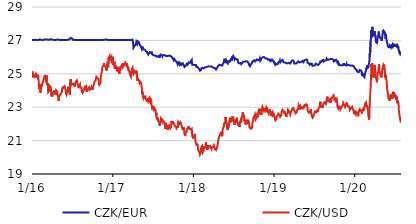
| Category | CZK/EUR | CZK/USD |
|---|---|---|
| 2016-01-04 | 27.02 | 24.794 |
| 2016-01-05 | 27.02 | 25.145 |
| 2016-01-06 | 27.025 | 25.196 |
| 2016-01-07 | 27.03 | 24.873 |
| 2016-01-08 | 27.02 | 24.873 |
| 2016-01-11 | 27.02 | 24.815 |
| 2016-01-12 | 27.02 | 24.937 |
| 2016-01-13 | 27.02 | 24.983 |
| 2016-01-14 | 27.02 | 24.804 |
| 2016-01-15 | 27.02 | 24.756 |
| 2016-01-18 | 27.035 | 24.821 |
| 2016-01-19 | 27.025 | 24.865 |
| 2016-01-20 | 27.04 | 24.789 |
| 2016-01-21 | 27.065 | 24.844 |
| 2016-01-22 | 27.025 | 25.002 |
| 2016-01-25 | 27.02 | 24.98 |
| 2016-01-26 | 27.02 | 24.928 |
| 2016-01-27 | 27.025 | 24.82 |
| 2016-01-28 | 27.02 | 24.78 |
| 2016-01-29 | 27.025 | 24.76 |
| 2016-02-01 | 27.02 | 24.823 |
| 2016-02-02 | 27.025 | 24.748 |
| 2016-02-03 | 27.02 | 24.72 |
| 2016-02-04 | 27.02 | 24.11 |
| 2016-02-05 | 27.035 | 24.134 |
| 2016-02-08 | 27.06 | 24.379 |
| 2016-02-09 | 27.06 | 24.09 |
| 2016-02-10 | 27.03 | 24.006 |
| 2016-02-11 | 27.07 | 23.857 |
| 2016-02-12 | 27.065 | 24.004 |
| 2016-02-15 | 27.035 | 24.182 |
| 2016-02-16 | 27.03 | 24.214 |
| 2016-02-17 | 27.03 | 24.276 |
| 2016-02-18 | 27.02 | 24.375 |
| 2016-02-19 | 27.025 | 24.351 |
| 2016-02-22 | 27.02 | 24.505 |
| 2016-02-23 | 27.03 | 24.57 |
| 2016-02-24 | 27.045 | 24.629 |
| 2016-02-25 | 27.05 | 24.526 |
| 2016-02-26 | 27.065 | 24.589 |
| 2016-02-29 | 27.055 | 24.848 |
| 2016-03-01 | 27.055 | 24.879 |
| 2016-03-02 | 27.045 | 24.933 |
| 2016-03-03 | 27.055 | 24.819 |
| 2016-03-04 | 27.06 | 24.661 |
| 2016-03-07 | 27.055 | 24.692 |
| 2016-03-08 | 27.06 | 24.541 |
| 2016-03-09 | 27.045 | 24.64 |
| 2016-03-10 | 27.035 | 24.899 |
| 2016-03-11 | 27.06 | 24.398 |
| 2016-03-14 | 27.05 | 24.324 |
| 2016-03-15 | 27.045 | 24.347 |
| 2016-03-16 | 27.05 | 24.45 |
| 2016-03-17 | 27.045 | 23.908 |
| 2016-03-18 | 27.035 | 23.966 |
| 2016-03-21 | 27.03 | 23.98 |
| 2016-03-22 | 27.035 | 24.117 |
| 2016-03-23 | 27.035 | 24.201 |
| 2016-03-24 | 27.065 | 24.267 |
| 2016-03-29 | 27.075 | 24.183 |
| 2016-03-30 | 27.075 | 23.896 |
| 2016-03-31 | 27.055 | 23.757 |
| 2016-04-01 | 27.03 | 23.64 |
| 2016-04-04 | 27.05 | 23.766 |
| 2016-04-05 | 27.035 | 23.774 |
| 2016-04-06 | 27.03 | 23.834 |
| 2016-04-07 | 27.025 | 23.775 |
| 2016-04-08 | 27.02 | 23.771 |
| 2016-04-11 | 27.025 | 23.724 |
| 2016-04-12 | 27.03 | 23.717 |
| 2016-04-13 | 27.035 | 23.923 |
| 2016-04-14 | 27.03 | 24.018 |
| 2016-04-15 | 27.025 | 23.948 |
| 2016-04-18 | 27.02 | 23.889 |
| 2016-04-19 | 27.02 | 23.821 |
| 2016-04-20 | 27.02 | 23.743 |
| 2016-04-21 | 27.025 | 23.798 |
| 2016-04-22 | 27.045 | 24.014 |
| 2016-04-25 | 27.045 | 24.014 |
| 2016-04-26 | 27.025 | 23.946 |
| 2016-04-27 | 27.035 | 23.916 |
| 2016-04-28 | 27.045 | 23.811 |
| 2016-04-29 | 27.04 | 23.714 |
| 2016-05-02 | 27.05 | 23.534 |
| 2016-05-03 | 27.035 | 23.383 |
| 2016-05-04 | 27.03 | 23.457 |
| 2016-05-05 | 27.03 | 23.628 |
| 2016-05-06 | 27.02 | 23.654 |
| 2016-05-09 | 27.02 | 23.717 |
| 2016-05-10 | 27.025 | 23.762 |
| 2016-05-11 | 27.02 | 23.681 |
| 2016-05-12 | 27.025 | 23.729 |
| 2016-05-13 | 27.02 | 23.81 |
| 2016-05-16 | 27.02 | 23.859 |
| 2016-05-17 | 27.02 | 23.873 |
| 2016-05-18 | 27.02 | 23.955 |
| 2016-05-19 | 27.02 | 24.133 |
| 2016-05-20 | 27.025 | 24.083 |
| 2016-05-23 | 27.035 | 24.106 |
| 2016-05-24 | 27.025 | 24.192 |
| 2016-05-25 | 27.03 | 24.253 |
| 2016-05-26 | 27.025 | 24.192 |
| 2016-05-27 | 27.03 | 24.203 |
| 2016-05-30 | 27.02 | 24.255 |
| 2016-05-31 | 27.02 | 24.223 |
| 2016-06-01 | 27.025 | 24.186 |
| 2016-06-02 | 27.03 | 24.167 |
| 2016-06-03 | 27.025 | 24.221 |
| 2016-06-06 | 27.025 | 23.805 |
| 2016-06-07 | 27.02 | 23.815 |
| 2016-06-08 | 27.02 | 23.743 |
| 2016-06-09 | 27.02 | 23.815 |
| 2016-06-10 | 27.025 | 23.905 |
| 2016-06-13 | 27.035 | 23.997 |
| 2016-06-14 | 27.045 | 24.088 |
| 2016-06-15 | 27.075 | 24.103 |
| 2016-06-16 | 27.065 | 24.224 |
| 2016-06-17 | 27.07 | 24.052 |
| 2016-06-20 | 27.06 | 23.877 |
| 2016-06-21 | 27.065 | 23.923 |
| 2016-06-22 | 27.07 | 23.976 |
| 2016-06-23 | 27.06 | 23.761 |
| 2016-06-24 | 27.1 | 24.491 |
| 2016-06-27 | 27.15 | 24.692 |
| 2016-06-28 | 27.11 | 24.484 |
| 2016-06-29 | 27.115 | 24.443 |
| 2016-06-30 | 27.13 | 24.433 |
| 2016-07-01 | 27.095 | 24.335 |
| 2016-07-04 | 27.095 | 24.322 |
| 2016-07-07 | 27.05 | 24.417 |
| 2016-07-08 | 27.03 | 24.421 |
| 2016-07-11 | 27.035 | 24.458 |
| 2016-07-12 | 27.035 | 24.367 |
| 2016-07-13 | 27.035 | 24.415 |
| 2016-07-14 | 27.04 | 24.235 |
| 2016-07-15 | 27.03 | 24.284 |
| 2016-07-18 | 27.025 | 24.446 |
| 2016-07-19 | 27.025 | 24.488 |
| 2016-07-20 | 27.02 | 24.532 |
| 2016-07-21 | 27.025 | 24.53 |
| 2016-07-22 | 27.025 | 24.535 |
| 2016-07-25 | 27.02 | 24.601 |
| 2016-07-26 | 27.025 | 24.573 |
| 2016-07-27 | 27.035 | 24.594 |
| 2016-07-28 | 27.045 | 24.382 |
| 2016-07-29 | 27.03 | 24.324 |
| 2016-08-01 | 27.03 | 24.212 |
| 2016-08-02 | 27.03 | 24.147 |
| 2016-08-03 | 27.035 | 24.143 |
| 2016-08-04 | 27.03 | 24.273 |
| 2016-08-05 | 27.02 | 24.219 |
| 2016-08-08 | 27.03 | 24.38 |
| 2016-08-09 | 27.025 | 24.392 |
| 2016-08-10 | 27.025 | 24.17 |
| 2016-08-11 | 27.02 | 24.224 |
| 2016-08-12 | 27.02 | 24.211 |
| 2016-08-15 | 27.02 | 24.162 |
| 2016-08-16 | 27.02 | 23.918 |
| 2016-08-17 | 27.025 | 23.973 |
| 2016-08-18 | 27.025 | 23.865 |
| 2016-08-19 | 27.02 | 23.851 |
| 2016-08-22 | 27.025 | 23.901 |
| 2016-08-23 | 27.025 | 23.832 |
| 2016-08-24 | 27.025 | 23.984 |
| 2016-08-25 | 27.03 | 23.938 |
| 2016-08-26 | 27.02 | 23.928 |
| 2016-08-29 | 27.02 | 24.192 |
| 2016-08-30 | 27.025 | 24.196 |
| 2016-08-31 | 27.03 | 24.286 |
| 2016-09-01 | 27.025 | 24.252 |
| 2016-09-02 | 27.02 | 24.138 |
| 2016-09-05 | 27.02 | 24.218 |
| 2016-09-06 | 27.02 | 24.211 |
| 2016-09-07 | 27.02 | 24.041 |
| 2016-09-08 | 27.02 | 23.921 |
| 2016-09-09 | 27.02 | 23.975 |
| 2016-09-12 | 27.025 | 24.074 |
| 2016-09-13 | 27.02 | 24.031 |
| 2016-09-14 | 27.025 | 24.083 |
| 2016-09-15 | 27.025 | 24.017 |
| 2016-09-16 | 27.025 | 24.073 |
| 2016-09-19 | 27.02 | 24.197 |
| 2016-09-20 | 27.02 | 24.16 |
| 2016-09-21 | 27.02 | 24.232 |
| 2016-09-22 | 27.02 | 24.046 |
| 2016-09-23 | 27.02 | 24.096 |
| 2016-09-26 | 27.02 | 23.992 |
| 2016-09-27 | 27.025 | 24.088 |
| 2016-09-29 | 27.02 | 24.076 |
| 2016-09-30 | 27.02 | 24.21 |
| 2016-10-03 | 27.02 | 24.049 |
| 2016-10-04 | 27.02 | 24.207 |
| 2016-10-05 | 27.02 | 24.085 |
| 2016-10-06 | 27.02 | 24.156 |
| 2016-10-07 | 27.02 | 24.249 |
| 2016-10-10 | 27.02 | 24.209 |
| 2016-10-11 | 27.02 | 24.387 |
| 2016-10-12 | 27.025 | 24.521 |
| 2016-10-13 | 27.02 | 24.478 |
| 2016-10-14 | 27.025 | 24.561 |
| 2016-10-17 | 27.025 | 24.584 |
| 2016-10-18 | 27.02 | 24.578 |
| 2016-10-19 | 27.02 | 24.611 |
| 2016-10-20 | 27.02 | 24.603 |
| 2016-10-21 | 27.02 | 24.82 |
| 2016-10-24 | 27.02 | 24.809 |
| 2016-10-25 | 27.02 | 24.846 |
| 2016-10-26 | 27.02 | 24.736 |
| 2016-10-27 | 27.02 | 24.729 |
| 2016-10-31 | 27.025 | 24.687 |
| 2016-11-01 | 27.025 | 24.508 |
| 2016-11-02 | 27.02 | 24.356 |
| 2016-11-03 | 27.02 | 24.426 |
| 2016-11-04 | 27.02 | 24.359 |
| 2016-11-07 | 27.02 | 24.424 |
| 2016-11-08 | 27.02 | 24.478 |
| 2016-11-09 | 27.025 | 24.521 |
| 2016-11-10 | 27.02 | 24.804 |
| 2016-11-11 | 27.055 | 24.802 |
| 2016-11-14 | 27.025 | 25.08 |
| 2016-11-15 | 27.03 | 25.106 |
| 2016-11-16 | 27.035 | 25.257 |
| 2016-11-18 | 27.035 | 25.436 |
| 2016-11-21 | 27.03 | 25.424 |
| 2016-11-22 | 27.045 | 25.474 |
| 2016-11-23 | 27.025 | 25.488 |
| 2016-11-24 | 27.035 | 25.629 |
| 2016-11-25 | 27.04 | 25.532 |
| 2016-11-28 | 27.045 | 25.538 |
| 2016-11-29 | 27.05 | 25.574 |
| 2016-11-30 | 27.06 | 25.455 |
| 2016-12-01 | 27.06 | 25.465 |
| 2016-12-02 | 27.06 | 25.426 |
| 2016-12-05 | 27.055 | 25.276 |
| 2016-12-06 | 27.045 | 25.191 |
| 2016-12-07 | 27.035 | 25.195 |
| 2016-12-08 | 27.04 | 25.134 |
| 2016-12-09 | 27.025 | 25.588 |
| 2016-12-12 | 27.025 | 25.511 |
| 2016-12-13 | 27.02 | 25.461 |
| 2016-12-14 | 27.025 | 25.386 |
| 2016-12-15 | 27.02 | 25.932 |
| 2016-12-16 | 27.02 | 25.882 |
| 2016-12-19 | 27.02 | 25.926 |
| 2016-12-20 | 27.02 | 26.068 |
| 2016-12-21 | 27.02 | 25.927 |
| 2016-12-22 | 27.02 | 25.869 |
| 2016-12-23 | 27.02 | 25.865 |
| 2016-12-27 | 27.02 | 25.866 |
| 2016-12-28 | 27.04 | 26 |
| 2016-12-29 | 27.02 | 25.849 |
| 2016-12-30 | 27.02 | 25.639 |
| 2017-01-02 | 27.02 | 25.819 |
| 2017-01-03 | 27.02 | 26.017 |
| 2017-01-04 | 27.02 | 25.889 |
| 2017-01-05 | 27.02 | 25.714 |
| 2017-01-06 | 27.02 | 25.516 |
| 2017-01-09 | 27.02 | 25.697 |
| 2017-01-10 | 27.02 | 25.571 |
| 2017-01-11 | 27.02 | 25.721 |
| 2017-01-12 | 27.02 | 25.3 |
| 2017-01-13 | 27.02 | 25.347 |
| 2017-01-16 | 27.02 | 25.503 |
| 2017-01-17 | 27.02 | 25.291 |
| 2017-01-18 | 27.02 | 25.335 |
| 2017-01-19 | 27.02 | 25.329 |
| 2017-01-20 | 27.02 | 25.414 |
| 2017-01-23 | 27.025 | 25.22 |
| 2017-01-24 | 27.02 | 25.141 |
| 2017-01-25 | 27.02 | 25.144 |
| 2017-01-26 | 27.02 | 25.252 |
| 2017-01-27 | 27.02 | 25.297 |
| 2017-01-30 | 27.02 | 25.421 |
| 2017-01-31 | 27.02 | 25.12 |
| 2017-02-01 | 27.02 | 25.074 |
| 2017-02-02 | 27.02 | 24.992 |
| 2017-02-03 | 27.02 | 25.155 |
| 2017-02-06 | 27.02 | 25.219 |
| 2017-02-07 | 27.02 | 25.306 |
| 2017-02-08 | 27.02 | 25.333 |
| 2017-02-09 | 27.02 | 25.268 |
| 2017-02-10 | 27.02 | 25.422 |
| 2017-02-13 | 27.02 | 25.421 |
| 2017-02-14 | 27.02 | 25.437 |
| 2017-02-15 | 27.02 | 25.596 |
| 2017-02-16 | 27.02 | 25.36 |
| 2017-02-17 | 27.02 | 25.372 |
| 2017-02-20 | 27.02 | 25.449 |
| 2017-02-21 | 27.02 | 25.644 |
| 2017-02-22 | 27.02 | 25.7 |
| 2017-02-23 | 27.02 | 25.556 |
| 2017-02-24 | 27.02 | 25.468 |
| 2017-02-27 | 27.02 | 25.522 |
| 2017-02-28 | 27.02 | 25.497 |
| 2017-03-01 | 27.02 | 25.654 |
| 2017-03-02 | 27.02 | 25.695 |
| 2017-03-03 | 27.02 | 25.574 |
| 2017-03-06 | 27.02 | 25.506 |
| 2017-03-07 | 27.02 | 25.547 |
| 2017-03-08 | 27.02 | 25.631 |
| 2017-03-09 | 27.02 | 25.613 |
| 2017-03-10 | 27.02 | 25.482 |
| 2017-03-13 | 27.02 | 25.339 |
| 2017-03-14 | 27.02 | 25.415 |
| 2017-03-15 | 27.02 | 25.434 |
| 2017-03-16 | 27.02 | 25.195 |
| 2017-03-17 | 27.02 | 25.154 |
| 2017-03-20 | 27.02 | 25.129 |
| 2017-03-21 | 27.02 | 25.009 |
| 2017-03-22 | 27.02 | 25.003 |
| 2017-03-23 | 27.02 | 25.05 |
| 2017-03-24 | 27.02 | 25.008 |
| 2017-03-27 | 27.02 | 24.813 |
| 2017-03-28 | 27.02 | 24.883 |
| 2017-03-29 | 27.02 | 25.14 |
| 2017-03-30 | 27.02 | 25.159 |
| 2017-03-31 | 27.03 | 25.282 |
| 2017-04-03 | 27.045 | 25.367 |
| 2017-04-04 | 27.055 | 25.404 |
| 2017-04-05 | 27.06 | 25.37 |
| 2017-04-06 | 26.75 | 25.076 |
| 2017-04-07 | 26.565 | 24.999 |
| 2017-04-10 | 26.53 | 25.082 |
| 2017-04-11 | 26.66 | 25.112 |
| 2017-04-12 | 26.695 | 25.172 |
| 2017-04-13 | 26.705 | 25.122 |
| 2017-04-18 | 26.76 | 25.053 |
| 2017-04-19 | 26.795 | 24.985 |
| 2017-04-20 | 26.91 | 25.043 |
| 2017-04-21 | 26.935 | 25.179 |
| 2017-04-24 | 26.795 | 24.706 |
| 2017-04-25 | 26.77 | 24.58 |
| 2017-04-26 | 26.945 | 24.735 |
| 2017-04-27 | 26.935 | 24.752 |
| 2017-04-28 | 26.92 | 24.629 |
| 2017-05-02 | 26.89 | 24.639 |
| 2017-05-03 | 26.87 | 24.607 |
| 2017-05-04 | 26.77 | 24.499 |
| 2017-05-05 | 26.78 | 24.433 |
| 2017-05-09 | 26.67 | 24.497 |
| 2017-05-10 | 26.64 | 24.486 |
| 2017-05-11 | 26.6 | 24.495 |
| 2017-05-12 | 26.575 | 24.435 |
| 2017-05-15 | 26.47 | 24.124 |
| 2017-05-16 | 26.42 | 23.888 |
| 2017-05-17 | 26.435 | 23.778 |
| 2017-05-18 | 26.63 | 23.927 |
| 2017-05-19 | 26.5 | 23.71 |
| 2017-05-22 | 26.485 | 23.557 |
| 2017-05-23 | 26.48 | 23.615 |
| 2017-05-24 | 26.465 | 23.642 |
| 2017-05-25 | 26.41 | 23.552 |
| 2017-05-26 | 26.435 | 23.606 |
| 2017-05-29 | 26.435 | 23.627 |
| 2017-05-30 | 26.465 | 23.69 |
| 2017-05-31 | 26.42 | 23.545 |
| 2017-06-01 | 26.395 | 23.554 |
| 2017-06-02 | 26.36 | 23.501 |
| 2017-06-05 | 26.325 | 23.401 |
| 2017-06-06 | 26.335 | 23.393 |
| 2017-06-07 | 26.315 | 23.459 |
| 2017-06-08 | 26.27 | 23.392 |
| 2017-06-09 | 26.22 | 23.463 |
| 2017-06-12 | 26.2 | 23.348 |
| 2017-06-13 | 26.145 | 23.308 |
| 2017-06-14 | 26.165 | 23.354 |
| 2017-06-15 | 26.21 | 23.468 |
| 2017-06-16 | 26.23 | 23.49 |
| 2017-06-19 | 26.17 | 23.369 |
| 2017-06-20 | 26.295 | 23.568 |
| 2017-06-21 | 26.265 | 23.565 |
| 2017-06-22 | 26.27 | 23.522 |
| 2017-06-23 | 26.295 | 23.53 |
| 2017-06-26 | 26.24 | 23.457 |
| 2017-06-27 | 26.27 | 23.29 |
| 2017-06-28 | 26.325 | 23.141 |
| 2017-06-29 | 26.285 | 23.032 |
| 2017-06-30 | 26.195 | 22.952 |
| 2017-07-03 | 26.14 | 22.993 |
| 2017-07-04 | 26.13 | 23.017 |
| 2017-07-07 | 26.08 | 22.852 |
| 2017-07-10 | 26.095 | 22.917 |
| 2017-07-11 | 26.125 | 22.907 |
| 2017-07-12 | 26.11 | 22.804 |
| 2017-07-13 | 26.12 | 22.878 |
| 2017-07-14 | 26.075 | 22.842 |
| 2017-07-17 | 26.09 | 22.762 |
| 2017-07-18 | 26.08 | 22.57 |
| 2017-07-19 | 26.035 | 22.572 |
| 2017-07-20 | 26.04 | 22.671 |
| 2017-07-21 | 26.02 | 22.347 |
| 2017-07-24 | 26.025 | 22.344 |
| 2017-07-25 | 26.02 | 22.25 |
| 2017-07-26 | 26.045 | 22.371 |
| 2017-07-27 | 26.045 | 22.269 |
| 2017-07-28 | 26.05 | 22.209 |
| 2017-07-31 | 26.08 | 22.24 |
| 2017-08-01 | 26.13 | 22.123 |
| 2017-08-02 | 26.125 | 22.099 |
| 2017-08-03 | 25.965 | 21.89 |
| 2017-08-04 | 26.065 | 21.961 |
| 2017-08-07 | 26.115 | 22.135 |
| 2017-08-08 | 26.15 | 22.134 |
| 2017-08-09 | 26.16 | 22.301 |
| 2017-08-10 | 26.16 | 22.297 |
| 2017-08-11 | 26.155 | 22.232 |
| 2017-08-14 | 26.12 | 22.143 |
| 2017-08-15 | 26.14 | 22.26 |
| 2017-08-16 | 26.045 | 22.243 |
| 2017-08-17 | 26.01 | 22.24 |
| 2017-08-18 | 26.11 | 22.243 |
| 2017-08-21 | 26.085 | 22.177 |
| 2017-08-22 | 26.085 | 22.16 |
| 2017-08-23 | 26.125 | 22.14 |
| 2017-08-24 | 26.1 | 22.106 |
| 2017-08-25 | 26.085 | 22.098 |
| 2017-08-28 | 26.1 | 21.887 |
| 2017-08-29 | 26.14 | 21.697 |
| 2017-08-30 | 26.045 | 21.849 |
| 2017-08-31 | 26.105 | 22.073 |
| 2017-09-01 | 26.075 | 21.871 |
| 2017-09-04 | 26.06 | 21.895 |
| 2017-09-05 | 26.075 | 21.928 |
| 2017-09-06 | 26.11 | 21.88 |
| 2017-09-07 | 26.11 | 21.801 |
| 2017-09-08 | 26.1 | 21.641 |
| 2017-09-11 | 26.075 | 21.736 |
| 2017-09-12 | 26.105 | 21.87 |
| 2017-09-13 | 26.1 | 21.787 |
| 2017-09-14 | 26.1 | 21.953 |
| 2017-09-15 | 26.08 | 21.794 |
| 2017-09-18 | 26.09 | 21.836 |
| 2017-09-19 | 26.105 | 21.809 |
| 2017-09-20 | 26.09 | 21.734 |
| 2017-09-21 | 26.085 | 21.891 |
| 2017-09-22 | 26.045 | 21.771 |
| 2017-09-25 | 26.035 | 21.937 |
| 2017-09-26 | 26.055 | 22.103 |
| 2017-09-27 | 26.035 | 22.176 |
| 2017-09-29 | 25.975 | 22.003 |
| 2017-10-02 | 25.995 | 22.135 |
| 2017-10-03 | 25.93 | 22.065 |
| 2017-10-04 | 25.885 | 21.97 |
| 2017-10-05 | 25.835 | 22.003 |
| 2017-10-06 | 25.815 | 22.05 |
| 2017-10-09 | 25.89 | 22.044 |
| 2017-10-10 | 25.9 | 21.96 |
| 2017-10-11 | 25.88 | 21.878 |
| 2017-10-12 | 25.89 | 21.837 |
| 2017-10-13 | 25.81 | 21.852 |
| 2017-10-16 | 25.765 | 21.828 |
| 2017-10-17 | 25.735 | 21.885 |
| 2017-10-18 | 25.705 | 21.881 |
| 2017-10-19 | 25.725 | 21.736 |
| 2017-10-20 | 25.69 | 21.739 |
| 2017-10-23 | 25.64 | 21.84 |
| 2017-10-24 | 25.58 | 21.753 |
| 2017-10-25 | 25.59 | 21.715 |
| 2017-10-26 | 25.585 | 21.779 |
| 2017-10-27 | 25.67 | 22.117 |
| 2017-10-30 | 25.645 | 22.086 |
| 2017-10-31 | 25.67 | 22.06 |
| 2017-11-01 | 25.555 | 22.008 |
| 2017-11-02 | 25.56 | 21.949 |
| 2017-11-03 | 25.65 | 22.006 |
| 2017-11-06 | 25.61 | 22.098 |
| 2017-11-07 | 25.59 | 22.132 |
| 2017-11-08 | 25.56 | 22.053 |
| 2017-11-09 | 25.53 | 21.954 |
| 2017-11-10 | 25.545 | 21.923 |
| 2017-11-13 | 25.565 | 21.929 |
| 2017-11-14 | 25.565 | 21.766 |
| 2017-11-15 | 25.67 | 21.684 |
| 2017-11-16 | 25.56 | 21.712 |
| 2017-11-20 | 25.565 | 21.701 |
| 2017-11-21 | 25.53 | 21.791 |
| 2017-11-22 | 25.47 | 21.677 |
| 2017-11-23 | 25.46 | 21.487 |
| 2017-11-24 | 25.41 | 21.392 |
| 2017-11-27 | 25.43 | 21.279 |
| 2017-11-28 | 25.46 | 21.418 |
| 2017-11-29 | 25.475 | 21.542 |
| 2017-11-30 | 25.495 | 21.519 |
| 2017-12-01 | 25.525 | 21.475 |
| 2017-12-04 | 25.56 | 21.541 |
| 2017-12-05 | 25.655 | 21.656 |
| 2017-12-06 | 25.635 | 21.695 |
| 2017-12-07 | 25.61 | 21.727 |
| 2017-12-08 | 25.555 | 21.765 |
| 2017-12-11 | 25.6 | 21.705 |
| 2017-12-12 | 25.625 | 21.776 |
| 2017-12-13 | 25.65 | 21.86 |
| 2017-12-14 | 25.685 | 21.682 |
| 2017-12-15 | 25.68 | 21.75 |
| 2017-12-18 | 25.685 | 21.775 |
| 2017-12-19 | 25.66 | 21.702 |
| 2017-12-20 | 25.675 | 21.677 |
| 2017-12-21 | 25.715 | 21.684 |
| 2017-12-22 | 25.75 | 21.725 |
| 2017-12-27 | 25.84 | 21.723 |
| 2017-12-28 | 25.645 | 21.489 |
| 2017-12-29 | 25.54 | 21.291 |
| 2018-01-02 | 25.495 | 21.13 |
| 2018-01-03 | 25.545 | 21.238 |
| 2018-01-04 | 25.51 | 21.16 |
| 2018-01-05 | 25.595 | 21.248 |
| 2018-01-08 | 25.525 | 21.324 |
| 2018-01-09 | 25.535 | 21.399 |
| 2018-01-10 | 25.565 | 21.315 |
| 2018-01-11 | 25.545 | 21.256 |
| 2018-01-12 | 25.52 | 21.025 |
| 2018-01-15 | 25.53 | 20.796 |
| 2018-01-16 | 25.515 | 20.863 |
| 2018-01-17 | 25.445 | 20.852 |
| 2018-01-18 | 25.37 | 20.742 |
| 2018-01-19 | 25.43 | 20.749 |
| 2018-01-22 | 25.4 | 20.752 |
| 2018-01-23 | 25.405 | 20.742 |
| 2018-01-24 | 25.375 | 20.543 |
| 2018-01-25 | 25.38 | 20.454 |
| 2018-01-26 | 25.355 | 20.392 |
| 2018-01-29 | 25.295 | 20.432 |
| 2018-01-30 | 25.33 | 20.394 |
| 2018-01-31 | 25.27 | 20.291 |
| 2018-02-01 | 25.265 | 20.281 |
| 2018-02-02 | 25.19 | 20.163 |
| 2018-02-05 | 25.2 | 20.256 |
| 2018-02-06 | 25.23 | 20.464 |
| 2018-02-07 | 25.23 | 20.448 |
| 2018-02-08 | 25.245 | 20.595 |
| 2018-02-09 | 25.335 | 20.645 |
| 2018-02-12 | 25.355 | 20.677 |
| 2018-02-13 | 25.385 | 20.583 |
| 2018-02-14 | 25.36 | 20.539 |
| 2018-02-15 | 25.37 | 20.307 |
| 2018-02-16 | 25.34 | 20.327 |
| 2018-02-19 | 25.325 | 20.406 |
| 2018-02-20 | 25.315 | 20.515 |
| 2018-02-21 | 25.36 | 20.604 |
| 2018-02-22 | 25.315 | 20.623 |
| 2018-02-23 | 25.335 | 20.603 |
| 2018-02-26 | 25.39 | 20.608 |
| 2018-02-27 | 25.405 | 20.652 |
| 2018-02-28 | 25.42 | 20.816 |
| 2018-03-01 | 25.435 | 20.898 |
| 2018-03-02 | 25.41 | 20.638 |
| 2018-03-05 | 25.405 | 20.642 |
| 2018-03-06 | 25.38 | 20.45 |
| 2018-03-07 | 25.415 | 20.47 |
| 2018-03-08 | 25.43 | 20.472 |
| 2018-03-09 | 25.455 | 20.717 |
| 2018-03-12 | 25.45 | 20.688 |
| 2018-03-13 | 25.47 | 20.577 |
| 2018-03-14 | 25.445 | 20.573 |
| 2018-03-15 | 25.415 | 20.594 |
| 2018-03-16 | 25.415 | 20.666 |
| 2018-03-19 | 25.43 | 20.661 |
| 2018-03-20 | 25.42 | 20.707 |
| 2018-03-21 | 25.42 | 20.689 |
| 2018-03-22 | 25.4 | 20.624 |
| 2018-03-23 | 25.405 | 20.586 |
| 2018-03-26 | 25.445 | 20.506 |
| 2018-03-27 | 25.475 | 20.586 |
| 2018-03-28 | 25.46 | 20.533 |
| 2018-03-29 | 25.43 | 20.641 |
| 2018-04-03 | 25.365 | 20.608 |
| 2018-04-04 | 25.34 | 20.645 |
| 2018-04-05 | 25.325 | 20.655 |
| 2018-04-06 | 25.34 | 20.714 |
| 2018-04-09 | 25.355 | 20.608 |
| 2018-04-10 | 25.335 | 20.497 |
| 2018-04-11 | 25.325 | 20.449 |
| 2018-04-12 | 25.315 | 20.548 |
| 2018-04-13 | 25.305 | 20.545 |
| 2018-04-16 | 25.26 | 20.435 |
| 2018-04-17 | 25.255 | 20.439 |
| 2018-04-18 | 25.3 | 20.424 |
| 2018-04-19 | 25.325 | 20.454 |
| 2018-04-20 | 25.34 | 20.584 |
| 2018-04-23 | 25.41 | 20.763 |
| 2018-04-24 | 25.435 | 20.827 |
| 2018-04-25 | 25.465 | 20.899 |
| 2018-04-26 | 25.475 | 20.944 |
| 2018-04-27 | 25.47 | 21.102 |
| 2018-04-30 | 25.54 | 21.144 |
| 2018-05-02 | 25.595 | 21.319 |
| 2018-05-03 | 25.58 | 21.332 |
| 2018-05-04 | 25.505 | 21.31 |
| 2018-05-07 | 25.515 | 21.438 |
| 2018-05-09 | 25.565 | 21.525 |
| 2018-05-10 | 25.495 | 21.465 |
| 2018-05-11 | 25.505 | 21.37 |
| 2018-05-14 | 25.49 | 21.264 |
| 2018-05-15 | 25.55 | 21.501 |
| 2018-05-16 | 25.545 | 21.679 |
| 2018-05-17 | 25.56 | 21.646 |
| 2018-05-18 | 25.59 | 21.718 |
| 2018-05-21 | 25.68 | 21.84 |
| 2018-05-22 | 25.7 | 21.791 |
| 2018-05-23 | 25.815 | 22.041 |
| 2018-05-24 | 25.81 | 22.011 |
| 2018-05-25 | 25.765 | 22.07 |
| 2018-05-28 | 25.73 | 22.095 |
| 2018-05-29 | 25.905 | 22.413 |
| 2018-05-30 | 25.835 | 22.202 |
| 2018-05-31 | 25.79 | 22.05 |
| 2018-06-01 | 25.83 | 22.137 |
| 2018-06-04 | 25.7 | 21.897 |
| 2018-06-05 | 25.65 | 21.971 |
| 2018-06-06 | 25.645 | 21.798 |
| 2018-06-07 | 25.64 | 21.662 |
| 2018-06-08 | 25.795 | 21.944 |
| 2018-06-11 | 25.68 | 21.781 |
| 2018-06-12 | 25.65 | 21.757 |
| 2018-06-13 | 25.71 | 21.856 |
| 2018-06-14 | 25.65 | 21.866 |
| 2018-06-15 | 25.71 | 22.171 |
| 2018-06-18 | 25.74 | 22.165 |
| 2018-06-19 | 25.81 | 22.373 |
| 2018-06-20 | 25.835 | 22.316 |
| 2018-06-21 | 25.865 | 22.413 |
| 2018-06-22 | 25.79 | 22.139 |
| 2018-06-25 | 25.935 | 22.172 |
| 2018-06-26 | 25.9 | 22.188 |
| 2018-06-27 | 25.77 | 22.184 |
| 2018-06-28 | 26 | 22.448 |
| 2018-06-29 | 26.02 | 22.318 |
| 2018-07-02 | 26 | 22.343 |
| 2018-07-03 | 26.075 | 22.356 |
| 2018-07-04 | 26.03 | 22.357 |
| 2018-07-09 | 25.86 | 21.934 |
| 2018-07-10 | 25.9 | 22.113 |
| 2018-07-11 | 25.93 | 22.099 |
| 2018-07-12 | 25.94 | 22.25 |
| 2018-07-13 | 25.92 | 22.262 |
| 2018-07-16 | 25.88 | 22.082 |
| 2018-07-17 | 25.875 | 22.1 |
| 2018-07-18 | 25.855 | 22.268 |
| 2018-07-19 | 25.92 | 22.368 |
| 2018-07-20 | 25.875 | 22.175 |
| 2018-07-23 | 25.85 | 22.065 |
| 2018-07-24 | 25.76 | 22.006 |
| 2018-07-25 | 25.675 | 21.965 |
| 2018-07-26 | 25.645 | 21.891 |
| 2018-07-27 | 25.62 | 22.039 |
| 2018-07-30 | 25.625 | 21.931 |
| 2018-07-31 | 25.6 | 21.814 |
| 2018-08-01 | 25.59 | 21.889 |
| 2018-08-02 | 25.6 | 22.04 |
| 2018-08-03 | 25.66 | 22.144 |
| 2018-08-06 | 25.65 | 22.221 |
| 2018-08-07 | 25.605 | 22.072 |
| 2018-08-08 | 25.58 | 22.076 |
| 2018-08-09 | 25.57 | 22.057 |
| 2018-08-10 | 25.635 | 22.377 |
| 2018-08-13 | 25.66 | 22.503 |
| 2018-08-14 | 25.69 | 22.524 |
| 2018-08-15 | 25.71 | 22.709 |
| 2018-08-16 | 25.7 | 22.606 |
| 2018-08-17 | 25.73 | 22.583 |
| 2018-08-20 | 25.705 | 22.509 |
| 2018-08-21 | 25.74 | 22.376 |
| 2018-08-22 | 25.725 | 22.149 |
| 2018-08-23 | 25.71 | 22.207 |
| 2018-08-24 | 25.745 | 22.218 |
| 2018-08-27 | 25.745 | 22.127 |
| 2018-08-28 | 25.72 | 21.963 |
| 2018-08-29 | 25.745 | 22.08 |
| 2018-08-30 | 25.75 | 22.025 |
| 2018-08-31 | 25.735 | 22.089 |
| 2018-09-03 | 25.75 | 22.183 |
| 2018-09-04 | 25.73 | 22.256 |
| 2018-09-05 | 25.745 | 22.238 |
| 2018-09-06 | 25.715 | 22.09 |
| 2018-09-07 | 25.695 | 22.124 |
| 2018-09-10 | 25.65 | 22.166 |
| 2018-09-11 | 25.65 | 22.157 |
| 2018-09-12 | 25.59 | 22.096 |
| 2018-09-13 | 25.52 | 21.965 |
| 2018-09-14 | 25.475 | 21.79 |
| 2018-09-17 | 25.455 | 21.811 |
| 2018-09-18 | 25.45 | 21.761 |
| 2018-09-19 | 25.43 | 21.796 |
| 2018-09-20 | 25.56 | 21.71 |
| 2018-09-21 | 25.585 | 21.756 |
| 2018-09-24 | 25.615 | 21.763 |
| 2018-09-25 | 25.615 | 21.752 |
| 2018-09-26 | 25.605 | 21.819 |
| 2018-09-27 | 25.715 | 21.967 |
| 2018-10-01 | 25.765 | 22.201 |
| 2018-10-02 | 25.79 | 22.343 |
| 2018-10-03 | 25.78 | 22.329 |
| 2018-10-04 | 25.78 | 22.415 |
| 2018-10-05 | 25.74 | 22.372 |
| 2018-10-08 | 25.735 | 22.426 |
| 2018-10-09 | 25.805 | 22.564 |
| 2018-10-10 | 25.805 | 22.44 |
| 2018-10-11 | 25.85 | 22.335 |
| 2018-10-12 | 25.775 | 22.269 |
| 2018-10-15 | 25.8 | 22.277 |
| 2018-10-16 | 25.815 | 22.283 |
| 2018-10-17 | 25.845 | 22.418 |
| 2018-10-18 | 25.86 | 22.476 |
| 2018-10-19 | 25.865 | 22.552 |
| 2018-10-22 | 25.84 | 22.483 |
| 2018-10-23 | 25.815 | 22.49 |
| 2018-10-24 | 25.83 | 22.685 |
| 2018-10-25 | 25.83 | 22.627 |
| 2018-10-26 | 25.86 | 22.797 |
| 2018-10-29 | 25.85 | 22.715 |
| 2018-10-30 | 25.87 | 22.75 |
| 2018-10-31 | 25.92 | 22.902 |
| 2018-11-01 | 25.875 | 22.712 |
| 2018-11-02 | 25.78 | 22.581 |
| 2018-11-05 | 25.845 | 22.73 |
| 2018-11-06 | 25.835 | 22.606 |
| 2018-11-07 | 25.88 | 22.531 |
| 2018-11-08 | 25.885 | 22.653 |
| 2018-11-09 | 25.935 | 22.857 |
| 2018-11-12 | 25.94 | 23.029 |
| 2018-11-13 | 25.94 | 23.032 |
| 2018-11-14 | 25.995 | 23.013 |
| 2018-11-15 | 25.985 | 22.992 |
| 2018-11-16 | 25.985 | 22.903 |
| 2018-11-19 | 26.01 | 22.761 |
| 2018-11-20 | 26.03 | 22.794 |
| 2018-11-21 | 26 | 22.788 |
| 2018-11-22 | 25.99 | 22.79 |
| 2018-11-23 | 25.955 | 22.866 |
| 2018-11-26 | 25.92 | 22.808 |
| 2018-11-27 | 25.915 | 22.874 |
| 2018-11-28 | 25.93 | 22.977 |
| 2018-11-29 | 25.965 | 22.802 |
| 2018-11-30 | 25.955 | 22.848 |
| 2018-12-03 | 25.92 | 22.874 |
| 2018-12-04 | 25.9 | 22.702 |
| 2018-12-05 | 25.885 | 22.802 |
| 2018-12-06 | 25.89 | 22.796 |
| 2018-12-07 | 25.85 | 22.736 |
| 2018-12-10 | 25.865 | 22.64 |
| 2018-12-11 | 25.845 | 22.711 |
| 2018-12-12 | 25.865 | 22.796 |
| 2018-12-13 | 25.83 | 22.716 |
| 2018-12-14 | 25.795 | 22.858 |
| 2018-12-17 | 25.8 | 22.749 |
| 2018-12-18 | 25.755 | 22.638 |
| 2018-12-19 | 25.76 | 22.591 |
| 2018-12-20 | 25.76 | 22.497 |
| 2018-12-21 | 25.855 | 22.654 |
| 2018-12-27 | 25.86 | 22.733 |
| 2018-12-28 | 25.78 | 22.506 |
| 2018-12-31 | 25.725 | 22.466 |
| 2019-01-02 | 25.75 | 22.594 |
| 2019-01-03 | 25.68 | 22.634 |
| 2019-01-04 | 25.65 | 22.494 |
| 2019-01-07 | 25.575 | 22.347 |
| 2019-01-08 | 25.64 | 22.416 |
| 2019-01-09 | 25.63 | 22.376 |
| 2019-01-10 | 25.625 | 22.221 |
| 2019-01-11 | 25.605 | 22.199 |
| 2019-01-14 | 25.56 | 22.29 |
| 2019-01-15 | 25.57 | 22.382 |
| 2019-01-16 | 25.565 | 22.446 |
| 2019-01-17 | 25.535 | 22.407 |
| 2019-01-18 | 25.58 | 22.432 |
| 2019-01-21 | 25.595 | 22.528 |
| 2019-01-22 | 25.61 | 22.559 |
| 2019-01-23 | 25.695 | 22.605 |
| 2019-01-24 | 25.695 | 22.659 |
| 2019-01-25 | 25.695 | 22.644 |
| 2019-01-28 | 25.725 | 22.529 |
| 2019-01-29 | 25.745 | 22.541 |
| 2019-01-30 | 25.8 | 22.579 |
| 2019-01-31 | 25.76 | 22.427 |
| 2019-02-01 | 25.695 | 22.398 |
| 2019-02-04 | 25.73 | 22.48 |
| 2019-02-05 | 25.7 | 22.508 |
| 2019-02-06 | 25.785 | 22.629 |
| 2019-02-07 | 25.805 | 22.747 |
| 2019-02-08 | 25.805 | 22.745 |
| 2019-02-11 | 25.835 | 22.845 |
| 2019-02-12 | 25.87 | 22.901 |
| 2019-02-13 | 25.795 | 22.819 |
| 2019-02-14 | 25.79 | 22.885 |
| 2019-02-15 | 25.7 | 22.823 |
| 2019-02-18 | 25.715 | 22.703 |
| 2019-02-19 | 25.715 | 22.771 |
| 2019-02-20 | 25.68 | 22.646 |
| 2019-02-21 | 25.645 | 22.586 |
| 2019-02-22 | 25.665 | 22.662 |
| 2019-02-25 | 25.65 | 22.589 |
| 2019-02-26 | 25.665 | 22.594 |
| 2019-02-27 | 25.655 | 22.532 |
| 2019-02-28 | 25.6 | 22.425 |
| 2019-03-01 | 25.635 | 22.52 |
| 2019-03-04 | 25.625 | 22.6 |
| 2019-03-05 | 25.62 | 22.614 |
| 2019-03-06 | 25.595 | 22.641 |
| 2019-03-07 | 25.61 | 22.72 |
| 2019-03-08 | 25.64 | 22.848 |
| 2019-03-11 | 25.655 | 22.818 |
| 2019-03-12 | 25.67 | 22.768 |
| 2019-03-13 | 25.67 | 22.711 |
| 2019-03-14 | 25.67 | 22.724 |
| 2019-03-15 | 25.67 | 22.694 |
| 2019-03-18 | 25.615 | 22.571 |
| 2019-03-19 | 25.6 | 22.537 |
| 2019-03-20 | 25.645 | 22.587 |
| 2019-03-21 | 25.65 | 22.528 |
| 2019-03-22 | 25.725 | 22.761 |
| 2019-03-25 | 25.76 | 22.752 |
| 2019-03-26 | 25.77 | 22.823 |
| 2019-03-27 | 25.8 | 22.912 |
| 2019-03-28 | 25.78 | 22.934 |
| 2019-03-29 | 25.8 | 22.968 |
| 2019-04-01 | 25.79 | 22.955 |
| 2019-04-02 | 25.75 | 22.99 |
| 2019-04-03 | 25.725 | 22.876 |
| 2019-04-04 | 25.695 | 22.91 |
| 2019-04-05 | 25.61 | 22.8 |
| 2019-04-08 | 25.635 | 22.794 |
| 2019-04-09 | 25.62 | 22.716 |
| 2019-04-10 | 25.61 | 22.711 |
| 2019-04-11 | 25.605 | 22.732 |
| 2019-04-12 | 25.62 | 22.633 |
| 2019-04-15 | 25.625 | 22.653 |
| 2019-04-16 | 25.665 | 22.701 |
| 2019-04-17 | 25.655 | 22.702 |
| 2019-04-18 | 25.68 | 22.826 |
| 2019-04-23 | 25.745 | 22.896 |
| 2019-04-24 | 25.73 | 22.95 |
| 2019-04-25 | 25.735 | 23.137 |
| 2019-04-26 | 25.705 | 23.091 |
| 2019-04-29 | 25.68 | 23.028 |
| 2019-04-30 | 25.66 | 22.864 |
| 2019-05-02 | 25.645 | 22.875 |
| 2019-05-03 | 25.715 | 23.055 |
| 2019-05-06 | 25.715 | 22.962 |
| 2019-05-07 | 25.73 | 23.005 |
| 2019-05-09 | 25.72 | 22.983 |
| 2019-05-10 | 25.73 | 22.915 |
| 2019-05-13 | 25.775 | 22.918 |
| 2019-05-14 | 25.75 | 22.942 |
| 2019-05-15 | 25.76 | 23.035 |
| 2019-05-16 | 25.695 | 22.933 |
| 2019-05-17 | 25.75 | 23.048 |
| 2019-05-20 | 25.765 | 23.073 |
| 2019-05-21 | 25.775 | 23.096 |
| 2019-05-22 | 25.79 | 23.089 |
| 2019-05-23 | 25.82 | 23.181 |
| 2019-05-24 | 25.83 | 23.091 |
| 2019-05-27 | 25.835 | 23.074 |
| 2019-05-28 | 25.845 | 23.092 |
| 2019-05-29 | 25.86 | 23.179 |
| 2019-05-30 | 25.84 | 23.208 |
| 2019-05-31 | 25.817 | 23.153 |
| 2019-06-03 | 25.83 | 23.093 |
| 2019-06-04 | 25.745 | 22.906 |
| 2019-06-05 | 25.65 | 22.77 |
| 2019-06-06 | 25.66 | 22.775 |
| 2019-06-07 | 25.64 | 22.745 |
| 2019-06-10 | 25.625 | 22.675 |
| 2019-06-11 | 25.64 | 22.651 |
| 2019-06-12 | 25.615 | 22.623 |
| 2019-06-13 | 25.58 | 22.659 |
| 2019-06-14 | 25.54 | 22.674 |
| 2019-06-17 | 25.56 | 22.752 |
| 2019-06-18 | 25.61 | 22.797 |
| 2019-06-19 | 25.635 | 22.874 |
| 2019-06-20 | 25.62 | 22.663 |
| 2019-06-21 | 25.61 | 22.632 |
| 2019-06-24 | 25.6 | 22.465 |
| 2019-06-25 | 25.555 | 22.438 |
| 2019-06-26 | 25.485 | 22.434 |
| 2019-06-27 | 25.435 | 22.372 |
| 2019-06-28 | 25.445 | 22.363 |
| 2019-07-01 | 25.48 | 22.453 |
| 2019-07-02 | 25.46 | 22.527 |
| 2019-07-03 | 25.455 | 22.535 |
| 2019-07-04 | 25.435 | 22.534 |
| 2019-07-08 | 25.51 | 22.745 |
| 2019-07-09 | 25.545 | 22.8 |
| 2019-07-10 | 25.565 | 22.785 |
| 2019-07-11 | 25.605 | 22.689 |
| 2019-07-12 | 25.59 | 22.742 |
| 2019-07-15 | 25.575 | 22.694 |
| 2019-07-16 | 25.575 | 22.796 |
| 2019-07-17 | 25.605 | 22.829 |
| 2019-07-18 | 25.585 | 22.811 |
| 2019-07-19 | 25.545 | 22.756 |
| 2019-07-22 | 25.535 | 22.771 |
| 2019-07-23 | 25.545 | 22.866 |
| 2019-07-24 | 25.54 | 22.927 |
| 2019-07-25 | 25.52 | 22.961 |
| 2019-07-26 | 25.54 | 22.932 |
| 2019-07-29 | 25.61 | 23.033 |
| 2019-07-30 | 25.65 | 22.996 |
| 2019-07-31 | 25.66 | 23.014 |
| 2019-08-01 | 25.74 | 23.326 |
| 2019-08-02 | 25.765 | 23.199 |
| 2019-08-05 | 25.775 | 23.052 |
| 2019-08-06 | 25.725 | 22.999 |
| 2019-08-07 | 25.72 | 22.96 |
| 2019-08-08 | 25.79 | 23.041 |
| 2019-08-09 | 25.83 | 23.068 |
| 2019-08-12 | 25.83 | 23.074 |
| 2019-08-13 | 25.83 | 23.019 |
| 2019-08-14 | 25.885 | 23.135 |
| 2019-08-15 | 25.88 | 23.211 |
| 2019-08-16 | 25.735 | 23.236 |
| 2019-08-19 | 25.78 | 23.219 |
| 2019-08-20 | 25.795 | 23.289 |
| 2019-08-21 | 25.795 | 23.231 |
| 2019-08-22 | 25.785 | 23.261 |
| 2019-08-23 | 25.765 | 23.274 |
| 2019-08-26 | 25.79 | 23.199 |
| 2019-08-27 | 25.815 | 23.252 |
| 2019-08-28 | 25.845 | 23.322 |
| 2019-08-29 | 25.85 | 23.344 |
| 2019-08-30 | 25.915 | 23.484 |
| 2019-09-02 | 25.92 | 23.632 |
| 2019-09-03 | 25.885 | 23.665 |
| 2019-09-04 | 25.835 | 23.444 |
| 2019-09-05 | 25.85 | 23.379 |
| 2019-09-06 | 25.835 | 23.424 |
| 2019-09-09 | 25.855 | 23.431 |
| 2019-09-10 | 25.865 | 23.431 |
| 2019-09-11 | 25.865 | 23.507 |
| 2019-09-12 | 25.83 | 23.565 |
| 2019-09-13 | 25.845 | 23.286 |
| 2019-09-16 | 25.88 | 23.461 |
| 2019-09-17 | 25.915 | 23.499 |
| 2019-09-18 | 25.89 | 23.424 |
| 2019-09-19 | 25.895 | 23.398 |
| 2019-09-20 | 25.91 | 23.49 |
| 2019-09-23 | 25.89 | 23.567 |
| 2019-09-24 | 25.87 | 23.514 |
| 2019-09-25 | 25.86 | 23.55 |
| 2019-09-26 | 25.85 | 23.636 |
| 2019-09-27 | 25.84 | 23.633 |
| 2019-09-30 | 25.815 | 23.707 |
| 2019-10-01 | 25.74 | 23.618 |
| 2019-10-02 | 25.74 | 23.561 |
| 2019-10-03 | 25.74 | 23.506 |
| 2019-10-04 | 25.74 | 23.444 |
| 2019-10-07 | 25.78 | 23.451 |
| 2019-10-08 | 25.805 | 23.488 |
| 2019-10-09 | 25.825 | 23.518 |
| 2019-10-10 | 25.89 | 23.476 |
| 2019-10-11 | 25.81 | 23.372 |
| 2019-10-14 | 25.825 | 23.411 |
| 2019-10-15 | 25.82 | 23.458 |
| 2019-10-16 | 25.76 | 23.365 |
| 2019-10-17 | 25.67 | 23.107 |
| 2019-10-18 | 25.66 | 23.026 |
| 2019-10-21 | 25.63 | 22.94 |
| 2019-10-22 | 25.575 | 22.974 |
| 2019-10-23 | 25.635 | 23.051 |
| 2019-10-24 | 25.595 | 23.003 |
| 2019-10-25 | 25.57 | 23.022 |
| 2019-10-29 | 25.545 | 23.022 |
| 2019-10-30 | 25.51 | 22.969 |
| 2019-10-31 | 25.51 | 22.871 |
| 2019-11-01 | 25.515 | 22.906 |
| 2019-11-04 | 25.515 | 22.866 |
| 2019-11-05 | 25.535 | 22.984 |
| 2019-11-06 | 25.5 | 22.98 |
| 2019-11-07 | 25.53 | 23.048 |
| 2019-11-08 | 25.485 | 23.099 |
| 2019-11-11 | 25.51 | 23.103 |
| 2019-11-12 | 25.5 | 23.152 |
| 2019-11-13 | 25.59 | 23.247 |
| 2019-11-14 | 25.56 | 23.232 |
| 2019-11-15 | 25.58 | 23.185 |
| 2019-11-18 | 25.59 | 23.135 |
| 2019-11-19 | 25.565 | 23.081 |
| 2019-11-20 | 25.535 | 23.099 |
| 2019-11-21 | 25.52 | 23.01 |
| 2019-11-22 | 25.51 | 23.069 |
| 2019-11-25 | 25.485 | 23.151 |
| 2019-11-26 | 25.505 | 23.145 |
| 2019-11-27 | 25.515 | 23.176 |
| 2019-11-28 | 25.575 | 23.24 |
| 2019-11-29 | 25.515 | 23.233 |
| 2019-12-02 | 25.535 | 23.166 |
| 2019-12-03 | 25.525 | 23.056 |
| 2019-12-04 | 25.52 | 23.016 |
| 2019-12-05 | 25.525 | 23.009 |
| 2019-12-06 | 25.535 | 23.017 |
| 2019-12-09 | 25.525 | 23.047 |
| 2019-12-10 | 25.525 | 23.043 |
| 2019-12-11 | 25.52 | 23.042 |
| 2019-12-12 | 25.52 | 22.915 |
| 2019-12-13 | 25.51 | 22.831 |
| 2019-12-16 | 25.485 | 22.863 |
| 2019-12-17 | 25.45 | 22.801 |
| 2019-12-18 | 25.49 | 22.933 |
| 2019-12-19 | 25.475 | 22.915 |
| 2019-12-20 | 25.445 | 22.937 |
| 2019-12-23 | 25.5 | 23.025 |
| 2019-12-27 | 25.51 | 22.873 |
| 2019-12-30 | 25.46 | 22.757 |
| 2019-12-31 | 25.41 | 22.621 |
| 2020-01-02 | 25.41 | 22.702 |
| 2020-01-03 | 25.36 | 22.753 |
| 2020-01-06 | 25.3 | 22.601 |
| 2020-01-07 | 25.275 | 22.626 |
| 2020-01-08 | 25.265 | 22.739 |
| 2020-01-09 | 25.255 | 22.733 |
| 2020-01-10 | 25.265 | 22.78 |
| 2020-01-13 | 25.23 | 22.677 |
| 2020-01-14 | 25.155 | 22.634 |
| 2020-01-15 | 25.145 | 22.567 |
| 2020-01-16 | 25.17 | 22.538 |
| 2020-01-17 | 25.145 | 22.638 |
| 2020-01-20 | 25.125 | 22.667 |
| 2020-01-21 | 25.065 | 22.552 |
| 2020-01-22 | 25.135 | 22.668 |
| 2020-01-23 | 25.16 | 22.686 |
| 2020-01-24 | 25.16 | 22.798 |
| 2020-01-27 | 25.23 | 22.883 |
| 2020-01-28 | 25.22 | 22.916 |
| 2020-01-29 | 25.205 | 22.913 |
| 2020-01-30 | 25.25 | 22.894 |
| 2020-01-31 | 25.21 | 22.81 |
| 2020-02-03 | 25.175 | 22.75 |
| 2020-02-04 | 25.145 | 22.761 |
| 2020-02-05 | 25.05 | 22.732 |
| 2020-02-06 | 24.895 | 22.627 |
| 2020-02-07 | 25.03 | 22.817 |
| 2020-02-10 | 25.025 | 22.851 |
| 2020-02-11 | 24.965 | 22.897 |
| 2020-02-12 | 24.875 | 22.792 |
| 2020-02-13 | 24.835 | 22.851 |
| 2020-02-14 | 24.825 | 22.897 |
| 2020-02-17 | 24.795 | 22.883 |
| 2020-02-18 | 24.9 | 23.023 |
| 2020-02-19 | 24.96 | 23.113 |
| 2020-02-20 | 25.035 | 23.205 |
| 2020-02-21 | 25.06 | 23.206 |
| 2020-02-24 | 25.19 | 23.284 |
| 2020-02-25 | 25.225 | 23.269 |
| 2020-02-26 | 25.345 | 23.308 |
| 2020-02-27 | 25.285 | 23.062 |
| 2020-02-28 | 25.39 | 23.124 |
| 2020-03-02 | 25.525 | 22.952 |
| 2020-03-03 | 25.475 | 22.919 |
| 2020-03-04 | 25.34 | 22.779 |
| 2020-03-05 | 25.355 | 22.665 |
| 2020-03-06 | 25.46 | 22.459 |
| 2020-03-09 | 25.505 | 22.265 |
| 2020-03-10 | 25.715 | 22.57 |
| 2020-03-11 | 25.77 | 22.737 |
| 2020-03-12 | 26.2 | 23.31 |
| 2020-03-13 | 26.04 | 23.449 |
| 2020-03-16 | 26.96 | 24.169 |
| 2020-03-17 | 26.98 | 24.569 |
| 2020-03-18 | 27.16 | 24.834 |
| 2020-03-19 | 27.605 | 25.567 |
| 2020-03-20 | 27.19 | 25.406 |
| 2020-03-23 | 27.635 | 25.629 |
| 2020-03-24 | 27.81 | 25.648 |
| 2020-03-25 | 27.44 | 25.351 |
| 2020-03-26 | 27.55 | 25.084 |
| 2020-03-27 | 27.3 | 24.879 |
| 2020-03-30 | 27.315 | 24.759 |
| 2020-03-31 | 27.325 | 24.943 |
| 2020-04-01 | 27.38 | 25.039 |
| 2020-04-02 | 27.555 | 25.287 |
| 2020-04-03 | 27.54 | 25.535 |
| 2020-04-06 | 27.595 | 25.567 |
| 2020-04-07 | 27.215 | 24.995 |
| 2020-04-08 | 27.2 | 25.021 |
| 2020-04-09 | 26.905 | 24.758 |
| 2020-04-14 | 26.855 | 24.494 |
| 2020-04-15 | 26.99 | 24.751 |
| 2020-04-16 | 27.055 | 24.85 |
| 2020-04-17 | 27.165 | 25.009 |
| 2020-04-20 | 27.325 | 25.163 |
| 2020-04-21 | 27.45 | 25.33 |
| 2020-04-22 | 27.53 | 25.334 |
| 2020-04-23 | 27.55 | 25.573 |
| 2020-04-24 | 27.31 | 25.292 |
| 2020-04-27 | 27.185 | 25.05 |
| 2020-04-28 | 27.225 | 25.036 |
| 2020-04-29 | 27.125 | 25.018 |
| 2020-04-30 | 27.095 | 24.915 |
| 2020-05-04 | 27.12 | 24.785 |
| 2020-05-05 | 26.985 | 24.888 |
| 2020-05-06 | 26.985 | 24.971 |
| 2020-05-07 | 27.145 | 25.181 |
| 2020-05-11 | 27.595 | 25.498 |
| 2020-05-12 | 27.42 | 25.254 |
| 2020-05-13 | 27.41 | 25.206 |
| 2020-05-14 | 27.57 | 25.551 |
| 2020-05-15 | 27.59 | 25.553 |
| 2020-05-18 | 27.61 | 25.483 |
| 2020-05-19 | 27.49 | 25.106 |
| 2020-05-20 | 27.43 | 25.032 |
| 2020-05-21 | 27.215 | 24.741 |
| 2020-05-22 | 27.21 | 24.953 |
| 2020-05-25 | 27.275 | 25.003 |
| 2020-05-26 | 27.07 | 24.661 |
| 2020-05-27 | 27.05 | 24.609 |
| 2020-05-28 | 27.015 | 24.521 |
| 2020-05-29 | 26.915 | 24.168 |
| 2020-06-01 | 26.86 | 24.163 |
| 2020-06-02 | 26.65 | 23.85 |
| 2020-06-03 | 26.66 | 23.815 |
| 2020-06-04 | 26.62 | 23.66 |
| 2020-06-05 | 26.59 | 23.469 |
| 2020-06-08 | 26.585 | 23.555 |
| 2020-06-09 | 26.635 | 23.59 |
| 2020-06-10 | 26.61 | 23.39 |
| 2020-06-11 | 26.675 | 23.505 |
| 2020-06-12 | 26.68 | 23.601 |
| 2020-06-15 | 26.68 | 23.71 |
| 2020-06-16 | 26.57 | 23.498 |
| 2020-06-17 | 26.56 | 23.647 |
| 2020-06-18 | 26.69 | 23.786 |
| 2020-06-19 | 26.685 | 23.806 |
| 2020-06-22 | 26.665 | 23.777 |
| 2020-06-23 | 26.61 | 23.509 |
| 2020-06-24 | 26.735 | 23.701 |
| 2020-06-25 | 26.795 | 23.926 |
| 2020-06-26 | 26.805 | 23.908 |
| 2020-06-29 | 26.85 | 23.797 |
| 2020-06-30 | 26.74 | 23.879 |
| 2020-07-01 | 26.67 | 23.81 |
| 2020-07-02 | 26.625 | 23.59 |
| 2020-07-03 | 26.665 | 23.757 |
| 2020-07-07 | 26.68 | 23.63 |
| 2020-07-08 | 26.745 | 23.698 |
| 2020-07-09 | 26.62 | 23.474 |
| 2020-07-10 | 26.69 | 23.672 |
| 2020-07-13 | 26.645 | 23.52 |
| 2020-07-14 | 26.635 | 23.411 |
| 2020-07-15 | 26.59 | 23.235 |
| 2020-07-16 | 26.69 | 23.385 |
| 2020-07-17 | 26.685 | 23.351 |
| 2020-07-20 | 26.6 | 23.233 |
| 2020-07-21 | 26.43 | 23.097 |
| 2020-07-22 | 26.365 | 22.77 |
| 2020-07-23 | 26.34 | 22.766 |
| 2020-07-24 | 26.265 | 22.625 |
| 2020-07-27 | 26.195 | 22.28 |
| 2020-07-28 | 26.255 | 22.407 |
| 2020-07-29 | 26.29 | 22.424 |
| 2020-07-30 | 26.25 | 22.352 |
| 2020-07-31 | 26.175 | 22.091 |